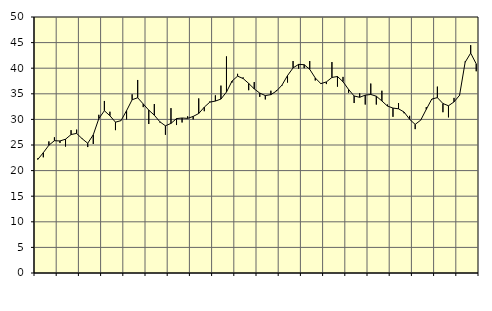
| Category | Piggar | Series 1 |
|---|---|---|
| nan | 22.4 | 22.18 |
| 1.0 | 22.6 | 23.5 |
| 1.0 | 25.7 | 24.96 |
| 1.0 | 26.5 | 25.84 |
| nan | 25.4 | 25.79 |
| 2.0 | 24.7 | 26.13 |
| 2.0 | 27.9 | 27.04 |
| 2.0 | 28 | 27.27 |
| nan | 26.3 | 26.22 |
| 3.0 | 24.6 | 25.34 |
| 3.0 | 25.2 | 26.99 |
| 3.0 | 30.9 | 30.15 |
| nan | 33.6 | 31.69 |
| 4.0 | 31.5 | 30.71 |
| 4.0 | 27.9 | 29.46 |
| 4.0 | 29.8 | 29.76 |
| nan | 30 | 31.71 |
| 5.0 | 34.9 | 33.84 |
| 5.0 | 37.7 | 34.23 |
| 5.0 | 32.4 | 33.02 |
| nan | 29.1 | 31.81 |
| 6.0 | 33 | 30.82 |
| 6.0 | 29.4 | 29.53 |
| 6.0 | 27 | 28.75 |
| nan | 32.2 | 29.22 |
| 7.0 | 28.9 | 30.16 |
| 7.0 | 29.4 | 30.27 |
| 7.0 | 30.6 | 30.2 |
| nan | 30 | 30.58 |
| 8.0 | 34.1 | 31.15 |
| 8.0 | 31.6 | 32.39 |
| 8.0 | 33.5 | 33.37 |
| nan | 34.7 | 33.58 |
| 9.0 | 36.6 | 33.97 |
| 9.0 | 42.3 | 35.34 |
| 9.0 | 37.2 | 37.48 |
| nan | 38.9 | 38.45 |
| 10.0 | 38.2 | 37.98 |
| 10.0 | 35.7 | 37.03 |
| 10.0 | 37.3 | 35.96 |
| nan | 34.4 | 35.14 |
| 11.0 | 33.9 | 34.65 |
| 11.0 | 35.6 | 34.84 |
| 11.0 | 35.7 | 35.53 |
| nan | 36.6 | 36.7 |
| 12.0 | 37.2 | 38.56 |
| 12.0 | 41.4 | 40.06 |
| 12.0 | 39.9 | 40.75 |
| nan | 40 | 40.68 |
| 13.0 | 41.4 | 39.78 |
| 13.0 | 37.6 | 38.09 |
| 13.0 | 37.1 | 36.99 |
| nan | 36.9 | 37.32 |
| 14.0 | 41.2 | 38.19 |
| 14.0 | 36.4 | 38.38 |
| 14.0 | 38.3 | 37.36 |
| nan | 35.2 | 35.85 |
| 15.0 | 33.2 | 34.57 |
| 15.0 | 35.1 | 34.32 |
| 15.0 | 32.9 | 34.74 |
| nan | 37 | 34.87 |
| 16.0 | 32.9 | 34.53 |
| 16.0 | 35.6 | 33.6 |
| 16.0 | 32.9 | 32.61 |
| nan | 30.5 | 32.21 |
| 17.0 | 33.2 | 32.07 |
| 17.0 | 31.2 | 31.44 |
| 17.0 | 30.7 | 30.02 |
| nan | 28.1 | 29.02 |
| 18.0 | 29.9 | 29.86 |
| 18.0 | 32.4 | 31.96 |
| 18.0 | 33.9 | 33.98 |
| nan | 36.4 | 34.25 |
| 19.0 | 31.4 | 33.1 |
| 19.0 | 30.4 | 32.66 |
| 19.0 | 34.2 | 33.42 |
| nan | 34.8 | 34.71 |
| 20.0 | 41.3 | 41.16 |
| 20.0 | 44.5 | 42.95 |
| 20.0 | 39.4 | 40.84 |